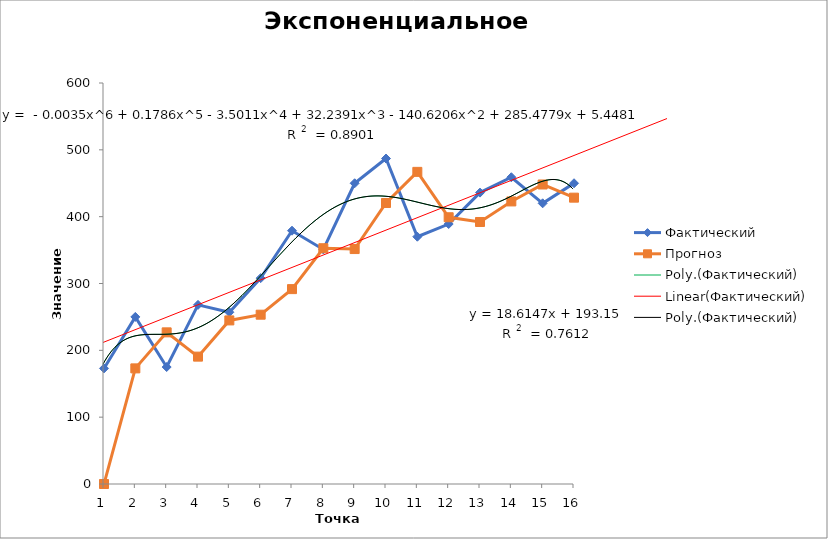
| Category | Фактический | Прогноз |
|---|---|---|
| 0 | 173 | 0 |
| 1 | 250 | 173 |
| 2 | 175 | 226.9 |
| 3 | 268 | 190.57 |
| 4 | 257 | 244.771 |
| 5 | 308 | 253.331 |
| 6 | 379 | 291.599 |
| 7 | 351 | 352.78 |
| 8 | 450 | 351.534 |
| 9 | 487 | 420.46 |
| 10 | 370 | 467.038 |
| 11 | 389 | 399.111 |
| 12 | 436 | 392.033 |
| 13 | 459 | 422.81 |
| 14 | 420 | 448.143 |
| 15 | 450 | 428.443 |